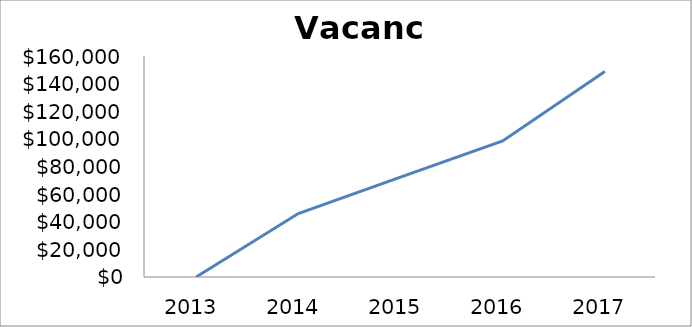
| Category | Series 0 |
|---|---|
| 2013.0 | 0 |
| 2014.0 | 45901.27 |
| 2015.0 | 72249.075 |
| 2016.0 | 98505.6 |
| 2017.0 | 148748.4 |